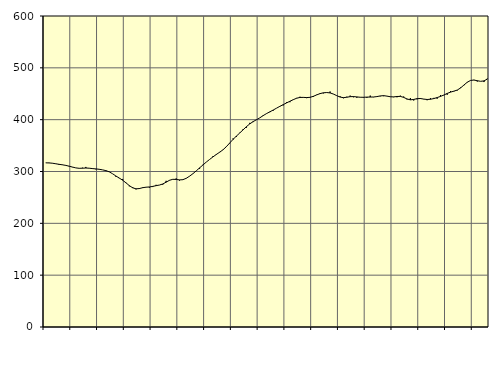
| Category | Piggar | Series 1 |
|---|---|---|
| nan | 316.8 | 316.72 |
| 87.0 | 316.8 | 316.53 |
| 87.0 | 316.2 | 315.98 |
| 87.0 | 314.6 | 314.95 |
| nan | 312.8 | 313.84 |
| 88.0 | 313.3 | 312.93 |
| 88.0 | 311.3 | 311.8 |
| 88.0 | 309.8 | 310.27 |
| nan | 308.3 | 308.58 |
| 89.0 | 307 | 306.98 |
| 89.0 | 306.1 | 306.17 |
| 89.0 | 307.3 | 306.36 |
| nan | 308.8 | 306.72 |
| 90.0 | 306.2 | 306.39 |
| 90.0 | 306.2 | 305.62 |
| 90.0 | 304.2 | 305.03 |
| nan | 303.8 | 304.3 |
| 91.0 | 303.2 | 303.17 |
| 91.0 | 300.7 | 301.68 |
| 91.0 | 299 | 299.39 |
| nan | 295.6 | 295.65 |
| 92.0 | 289.9 | 291.29 |
| 92.0 | 286.9 | 287.36 |
| 92.0 | 285.6 | 283.18 |
| nan | 277.7 | 278.16 |
| 93.0 | 271.5 | 272.77 |
| 93.0 | 270 | 268.54 |
| 93.0 | 265.5 | 266.58 |
| nan | 268.1 | 267.08 |
| 94.0 | 269.5 | 268.77 |
| 94.0 | 269.6 | 269.73 |
| 94.0 | 268.9 | 270.16 |
| nan | 270 | 271.27 |
| 95.0 | 274.3 | 272.68 |
| 95.0 | 273.8 | 273.87 |
| 95.0 | 274.6 | 275.93 |
| nan | 282 | 279.39 |
| 96.0 | 282.6 | 283.01 |
| 96.0 | 284.8 | 284.93 |
| 96.0 | 286.6 | 284.69 |
| nan | 282.5 | 283.81 |
| 97.0 | 283.7 | 284.23 |
| 97.0 | 286.5 | 286.82 |
| 97.0 | 291.2 | 290.93 |
| nan | 295.5 | 295.74 |
| 98.0 | 301.3 | 301.21 |
| 98.0 | 305.2 | 307.01 |
| 98.0 | 313 | 312.55 |
| nan | 318.2 | 318.17 |
| 99.0 | 323.2 | 323.27 |
| 99.0 | 329.6 | 328.18 |
| 99.0 | 332.1 | 332.84 |
| nan | 337.7 | 337.21 |
| 0.0 | 341.6 | 341.88 |
| 0.0 | 347.3 | 347.82 |
| 0.0 | 354.3 | 354.96 |
| nan | 363.7 | 361.92 |
| 1.0 | 366.6 | 368.26 |
| 1.0 | 374.7 | 374.25 |
| 1.0 | 381.8 | 380.38 |
| nan | 384.4 | 386.51 |
| 2.0 | 393.8 | 391.87 |
| 2.0 | 395.3 | 396.23 |
| 2.0 | 400.2 | 399.83 |
| nan | 403.6 | 403.53 |
| 3.0 | 408.6 | 407.81 |
| 3.0 | 412 | 411.72 |
| 3.0 | 414.5 | 415.12 |
| nan | 417.4 | 418.61 |
| 4.0 | 422.1 | 422.15 |
| 4.0 | 426.1 | 425.73 |
| 4.0 | 427.5 | 429 |
| nan | 433.8 | 432.35 |
| 5.0 | 433.7 | 435.51 |
| 5.0 | 439.1 | 438.56 |
| 5.0 | 441.9 | 441.36 |
| nan | 444.2 | 442.88 |
| 6.0 | 442.5 | 442.99 |
| 6.0 | 441.5 | 442.63 |
| 6.0 | 443.4 | 443.09 |
| nan | 443.7 | 445.03 |
| 7.0 | 448.2 | 447.77 |
| 7.0 | 450.9 | 450.28 |
| 7.0 | 450.7 | 451.83 |
| nan | 452.6 | 452.34 |
| 8.0 | 454.3 | 451.61 |
| 8.0 | 449.3 | 449.44 |
| 8.0 | 446.1 | 446.32 |
| nan | 445 | 443.59 |
| 9.0 | 441.3 | 442.43 |
| 9.0 | 444.3 | 443.25 |
| 9.0 | 446.4 | 444.39 |
| nan | 443.2 | 444.52 |
| 10.0 | 442.3 | 443.89 |
| 10.0 | 443.4 | 443.25 |
| 10.0 | 442.5 | 443.17 |
| nan | 442.1 | 443.52 |
| 11.0 | 446.4 | 443.63 |
| 11.0 | 443.4 | 443.76 |
| 11.0 | 444.4 | 444.53 |
| nan | 445.1 | 445.8 |
| 12.0 | 445.3 | 446.33 |
| 12.0 | 445.3 | 445.43 |
| 12.0 | 444 | 444.23 |
| nan | 443.4 | 443.92 |
| 13.0 | 443.2 | 444.71 |
| 13.0 | 446.3 | 444.89 |
| 13.0 | 444.6 | 442.98 |
| nan | 439.1 | 439.94 |
| 14.0 | 441.6 | 438.26 |
| 14.0 | 437 | 439.01 |
| 14.0 | 439.3 | 440.54 |
| nan | 441.8 | 440.83 |
| 15.0 | 439.4 | 439.71 |
| 15.0 | 437.5 | 438.92 |
| 15.0 | 441.4 | 439.38 |
| nan | 442 | 440.69 |
| 16.0 | 440.4 | 442.63 |
| 16.0 | 447.4 | 444.87 |
| 16.0 | 447.1 | 447.55 |
| nan | 448 | 450.59 |
| 17.0 | 455.3 | 453.12 |
| 17.0 | 454.4 | 454.98 |
| 17.0 | 456.3 | 457.09 |
| nan | 462 | 461.14 |
| 18.0 | 466.3 | 466.78 |
| 18.0 | 472.7 | 472.18 |
| 18.0 | 475.9 | 475.72 |
| nan | 476.8 | 476.43 |
| 19.0 | 473.6 | 475.12 |
| 19.0 | 474 | 473.98 |
| 19.0 | 472.6 | 474.78 |
| nan | 479.2 | 478.33 |